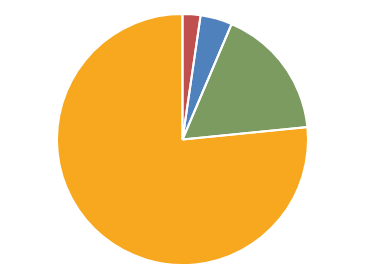
| Category | Voted |
|---|---|
| Asian | 10953 |
| Black | 19419 |
| Hispanic | 80786 |
| White & Other | 363641 |